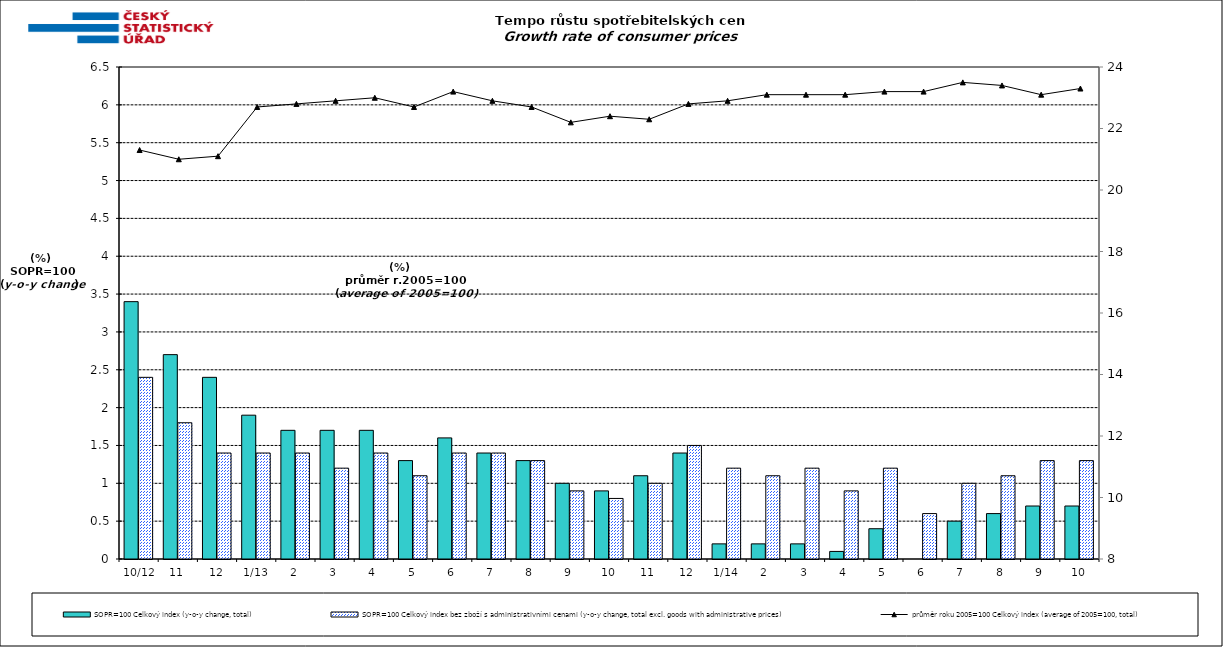
| Category | SOPR=100 Celkový index (y-o-y change, total) | SOPR=100 Celkový index bez zboží s administrativními cenami (y-o-y change, total excl. goods with administrative prices)  |
|---|---|---|
|  10/12 | 3.4 | 2.4 |
| 11 | 2.7 | 1.8 |
| 12 | 2.4 | 1.4 |
| 1/13 | 1.9 | 1.4 |
| 2 | 1.7 | 1.4 |
| 3 | 1.7 | 1.2 |
| 4 | 1.7 | 1.4 |
| 5 | 1.3 | 1.1 |
| 6 | 1.6 | 1.4 |
| 7 | 1.4 | 1.4 |
| 8 | 1.3 | 1.3 |
| 9 | 1 | 0.9 |
| 10 | 0.9 | 0.8 |
| 11 | 1.1 | 1 |
| 12 | 1.4 | 1.5 |
| 1/14 | 0.2 | 1.2 |
| 2 | 0.2 | 1.1 |
| 3 | 0.2 | 1.2 |
| 4 | 0.1 | 0.9 |
| 5 | 0.4 | 1.2 |
| 6 | 0 | 0.6 |
| 7 | 0.5 | 1 |
| 8 | 0.6 | 1.1 |
| 9 | 0.7 | 1.3 |
| 10 | 0.7 | 1.3 |